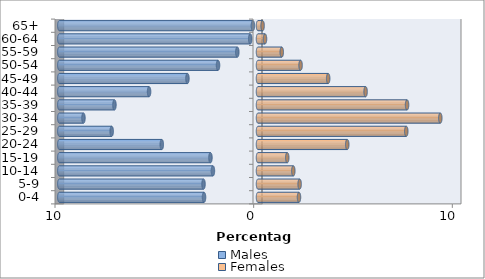
| Category | Males | Females |
|---|---|---|
| 0-4 | -2.717 | 2.063 |
| 5-9 | -2.743 | 2.096 |
| 10-14 | -2.27 | 1.778 |
| 15-19 | -2.393 | 1.473 |
| 20-24 | -4.843 | 4.492 |
| 25-29 | -7.365 | 7.464 |
| 30-34 | -8.787 | 9.177 |
| 35-39 | -7.227 | 7.503 |
| 40-44 | -5.483 | 5.416 |
| 45-49 | -3.553 | 3.532 |
| 50-54 | -2.012 | 2.143 |
| 55-59 | -1.042 | 1.196 |
| 60-64 | -0.391 | 0.353 |
| 65+ | -0.258 | 0.232 |